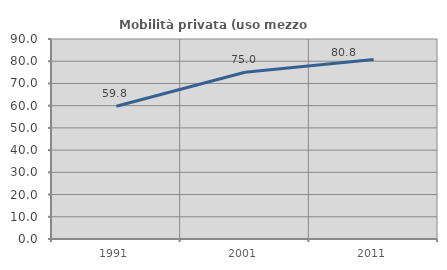
| Category | Mobilità privata (uso mezzo privato) |
|---|---|
| 1991.0 | 59.751 |
| 2001.0 | 75.026 |
| 2011.0 | 80.797 |